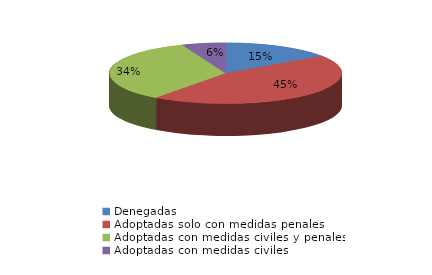
| Category | Series 0 |
|---|---|
| Denegadas | 56 |
| Adoptadas solo con medidas penales | 164 |
| Adoptadas con medidas civiles y penales | 124 |
| Adoptadas con medidas civiles | 22 |